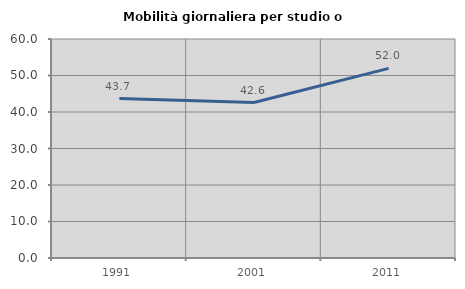
| Category | Mobilità giornaliera per studio o lavoro |
|---|---|
| 1991.0 | 43.696 |
| 2001.0 | 42.587 |
| 2011.0 | 51.955 |